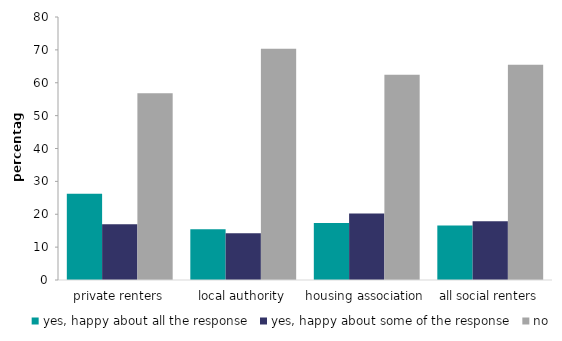
| Category | yes, happy about all the response | yes, happy about some of the response | no |
|---|---|---|---|
| private renters | 26.206 | 16.968 | 56.826 |
| local authority | 15.444 | 14.213 | 70.343 |
| housing association | 17.32 | 20.208 | 62.471 |
| all social renters | 16.596 | 17.896 | 65.508 |